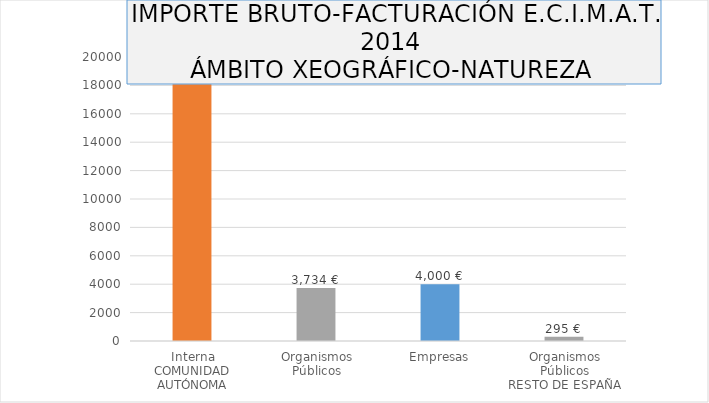
| Category | Series 0 |
|---|---|
| 0 | 18081.15 |
| 1 | 3733.87 |
| 2 | 4000 |
| 3 | 295 |